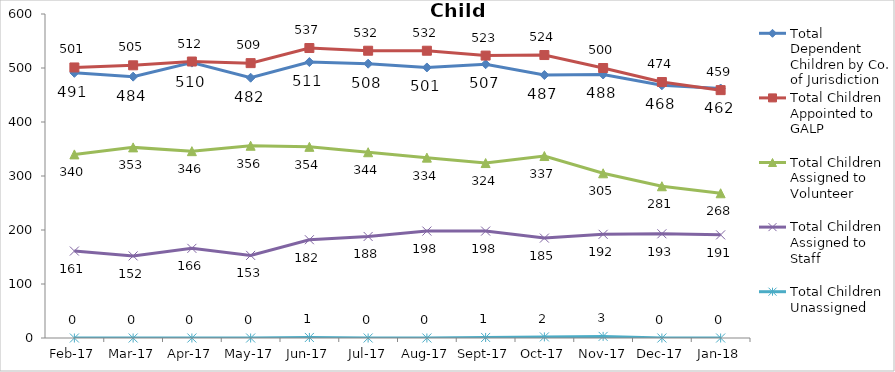
| Category | Total Dependent Children by Co. of Jurisdiction | Total Children Appointed to GALP | Total Children Assigned to Volunteer | Total Children Assigned to Staff | Total Children Unassigned |
|---|---|---|---|---|---|
| 2017-02-01 | 491 | 501 | 340 | 161 | 0 |
| 2017-03-01 | 484 | 505 | 353 | 152 | 0 |
| 2017-04-01 | 510 | 512 | 346 | 166 | 0 |
| 2017-05-01 | 482 | 509 | 356 | 153 | 0 |
| 2017-06-01 | 511 | 537 | 354 | 182 | 1 |
| 2017-07-01 | 508 | 532 | 344 | 188 | 0 |
| 2017-08-01 | 501 | 532 | 334 | 198 | 0 |
| 2017-09-01 | 507 | 523 | 324 | 198 | 1 |
| 2017-10-01 | 487 | 524 | 337 | 185 | 2 |
| 2017-11-01 | 488 | 500 | 305 | 192 | 3 |
| 2017-12-01 | 468 | 474 | 281 | 193 | 0 |
| 2018-01-01 | 462 | 459 | 268 | 191 | 0 |